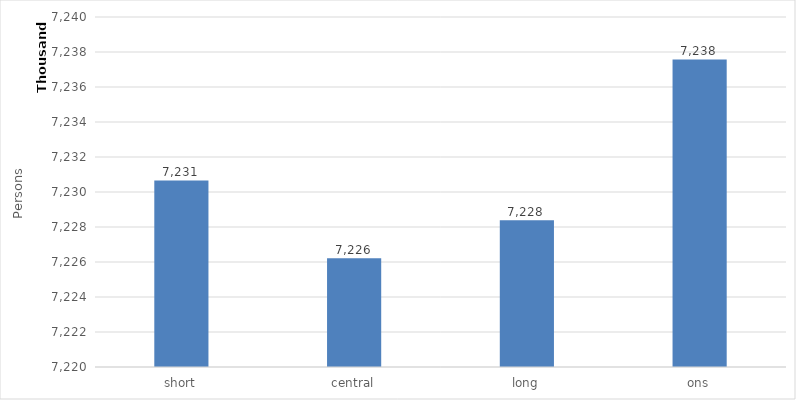
| Category | Series 0 |
|---|---|
| short | 7230660.897 |
| central | 7226214.581 |
| long | 7228383.479 |
| ons | 7237577.002 |